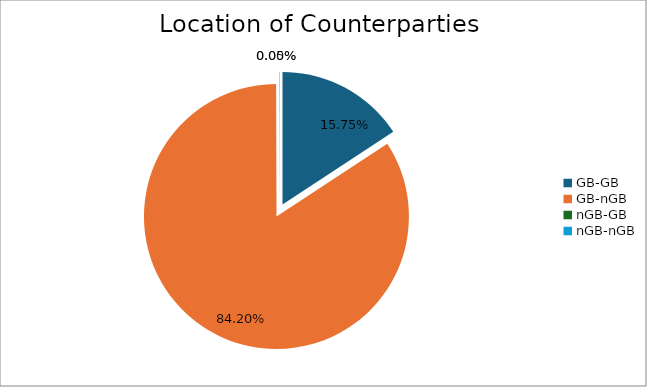
| Category | Series 0 |
|---|---|
| GB-GB | 1799764.469 |
| GB-nGB | 9618887.329 |
| nGB-GB | 0 |
| nGB-nGB | 5579.992 |